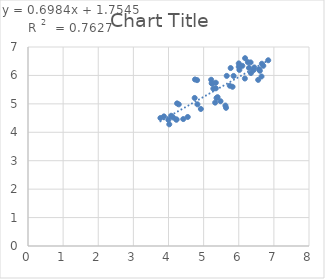
| Category | Series 0 |
|---|---|
| 5.481 | 5.093 |
| 6.0 | 6.303 |
| 6.553 | 5.843 |
| 4.022 | 4.28 |
| 4.244 | 5.017 |
| 4.292 | 4.982 |
| 6.444 | 6.281 |
| 6.577 | 6.214 |
| 6.658 | 6.411 |
| 6.699 | 6.338 |
| 6.602 | 6.165 |
| 6.42 | 6.185 |
| 6.347 | 6.082 |
| 5.276 | 5.535 |
| 5.252 | 5.71 |
| 5.347 | 5.547 |
| 3.87 | 4.559 |
| 6.337 | 6.458 |
| 6.26 | 6.466 |
| 6.018 | 6.195 |
| 4.754 | 5.858 |
| 6.0 | 6.423 |
| 5.62 | 4.94 |
| 5.367 | 5.206 |
| 4.824 | 4.983 |
| 3.996 | 4.437 |
| 4.548 | 4.538 |
| 4.229 | 4.451 |
| 4.131 | 4.522 |
| 3.77 | 4.503 |
| 4.921 | 4.82 |
| 4.076 | 4.581 |
| 5.658 | 5.984 |
| 4.815 | 5.834 |
| 5.215 | 5.848 |
| 5.347 | 5.743 |
| 5.824 | 5.601 |
| 5.745 | 5.638 |
| 6.648 | 5.963 |
| 6.839 | 6.533 |
| 6.174 | 5.891 |
| 4.222 | 4.445 |
| 4.745 | 5.207 |
| 6.292 | 6.264 |
| 5.77 | 6.26 |
| 6.102 | 6.336 |
| 5.854 | 5.982 |
| 6.18 | 6.606 |
| 5.398 | 5.235 |
| 5.229 | 5.723 |
| 5.638 | 4.861 |
| 4.42 | 4.465 |
| 5.328 | 5.043 |